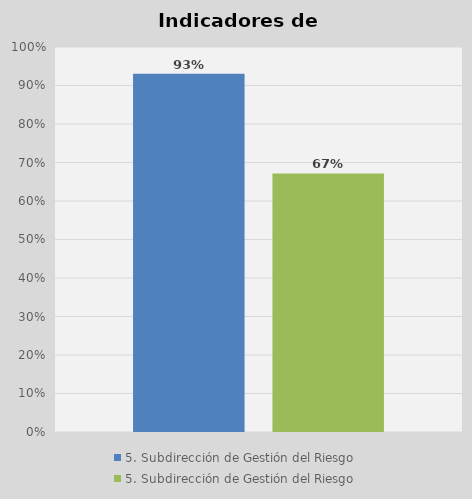
| Category | 5. Subdirección de Gestión del Riesgo |
|---|---|
| 0 | 0.672 |